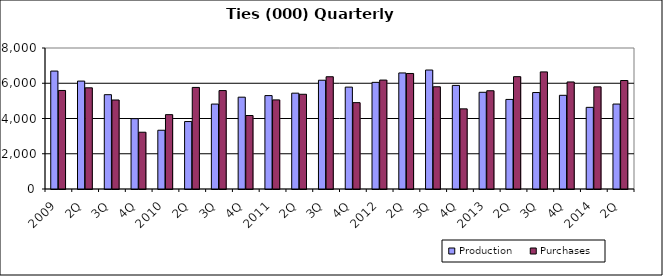
| Category | Production | Purchases |
|---|---|---|
| 2009 | 6691.392 | 5590.76 |
| 2Q | 6123.176 | 5741.405 |
| 3Q | 5351.772 | 5050.331 |
| 4Q | 3989.949 | 3221.559 |
| 2010 | 3333.68 | 4218.678 |
| 2Q | 3827.981 | 5762.886 |
| 3Q | 4818.715 | 5584.917 |
| 4Q | 5209.724 | 4169.501 |
| 2011 | 5299.864 | 5056.504 |
| 2Q | 5437.362 | 5374.245 |
| 3Q | 6171.868 | 6368.887 |
| 4Q | 5780.324 | 4899.945 |
| 2012 | 6051.305 | 6180.123 |
| 2Q | 6584.897 | 6554.489 |
| 3Q | 6750.644 | 5799.695 |
| 4Q | 5877.605 | 4547.244 |
| 2013 | 5487.558 | 5575.07 |
| 2Q | 5082.038 | 6373.523 |
| 3Q | 5474.141 | 6643.033 |
| 4Q | 5316.028 | 6072.825 |
| 2014 | 4632.581 | 5794.828 |
| 2Q | 4819.959 | 6155.525 |